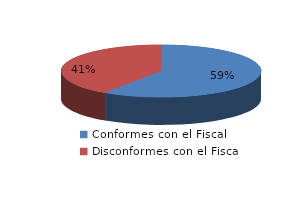
| Category | Series 0 |
|---|---|
| 0 | 430 |
| 1 | 294 |